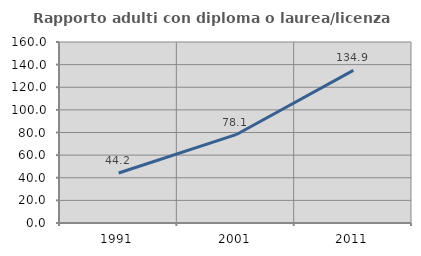
| Category | Rapporto adulti con diploma o laurea/licenza media  |
|---|---|
| 1991.0 | 44.193 |
| 2001.0 | 78.064 |
| 2011.0 | 134.938 |